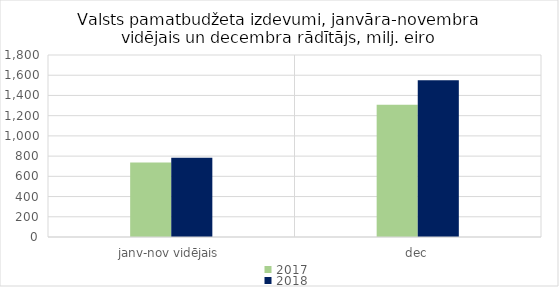
| Category | 2017 | 2018 |
|---|---|---|
| janv-nov vidējais | 736548.581 | 784625.88 |
| dec | 1308324.606 | 1550280.295 |